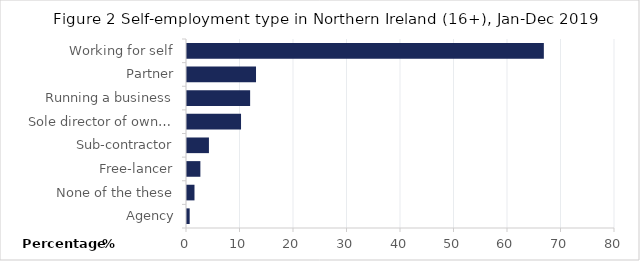
| Category | Percentage |
|---|---|
| Agency | 0.5 |
| None of the these | 1.4 |
| Free-lancer | 2.5 |
| Sub-contractor | 4.1 |
| Sole director of own… | 10.1 |
| Running a business | 11.8 |
| Partner | 12.9 |
| Working for self | 66.7 |